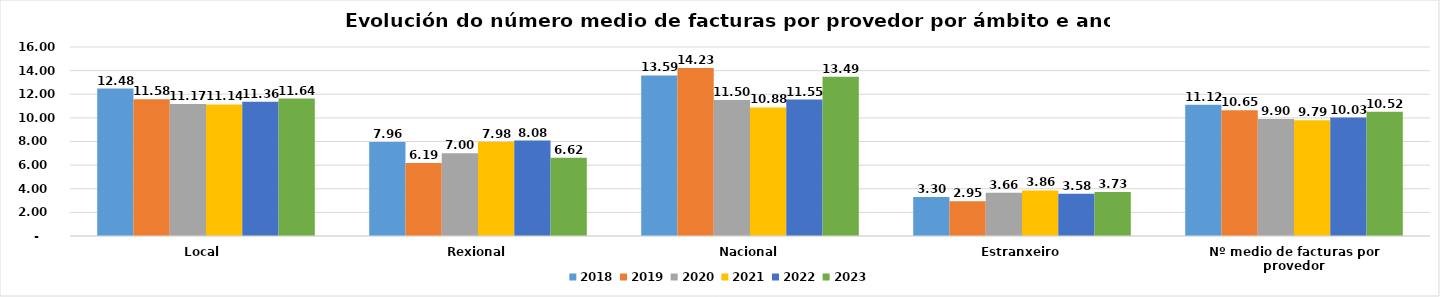
| Category | 2018 | 2019 | 2020 | 2021 | 2022 | 2023 |
|---|---|---|---|---|---|---|
| Local  | 12.478 | 11.575 | 11.173 | 11.14 | 11.357 | 11.637 |
| Rexional | 7.958 | 6.186 | 7 | 7.98 | 8.076 | 6.619 |
| Nacional | 13.589 | 14.229 | 11.504 | 10.88 | 11.549 | 13.488 |
| Estranxeiro | 3.3 | 2.946 | 3.658 | 3.86 | 3.576 | 3.734 |
| Nº medio de facturas por provedor | 11.12 | 10.649 | 9.899 | 9.79 | 10.029 | 10.52 |